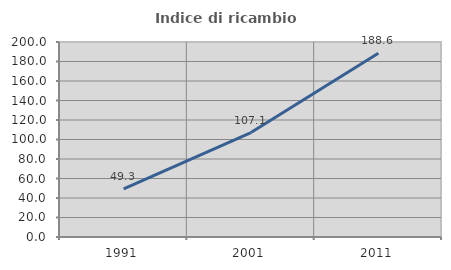
| Category | Indice di ricambio occupazionale  |
|---|---|
| 1991.0 | 49.311 |
| 2001.0 | 107.119 |
| 2011.0 | 188.554 |